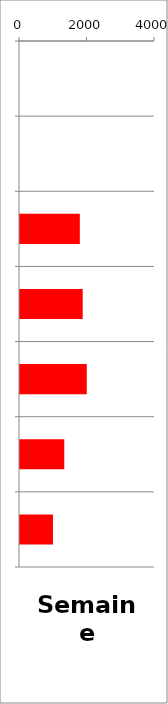
| Category | VL |
|---|---|
| 0 | 0 |
| 1 | 0 |
| 2 | 1773 |
| 3 | 1858 |
| 4 | 1978 |
| 5 | 1312 |
| 6 | 977 |